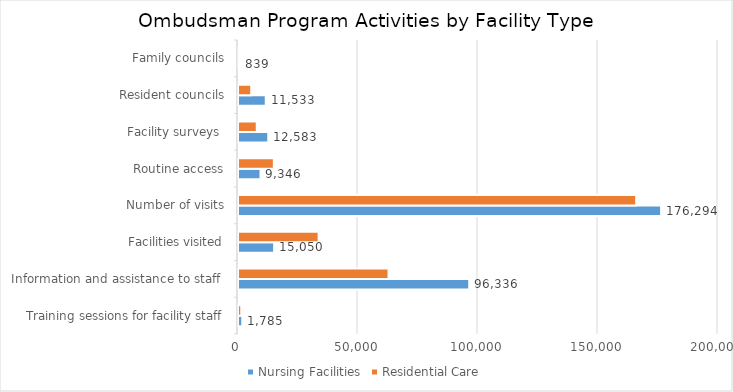
| Category | Nursing Facilities | Residential Care |
|---|---|---|
| Training sessions for facility staff | 1785 | 1321 |
| Information and assistance to staff  | 96336 | 62728 |
| Facilities visited | 15050 | 33595 |
| Number of visits | 176294 | 165895 |
| Routine access | 9346 | 14927 |
| Facility surveys  | 12583 | 7864 |
| Resident councils | 11533 | 5562 |
| Family councils | 839 | 432 |